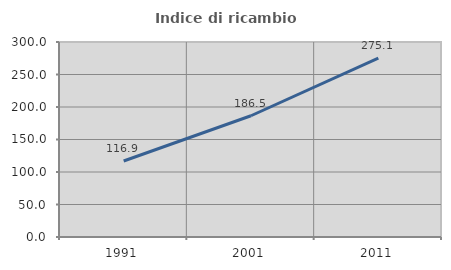
| Category | Indice di ricambio occupazionale  |
|---|---|
| 1991.0 | 116.88 |
| 2001.0 | 186.548 |
| 2011.0 | 275.086 |